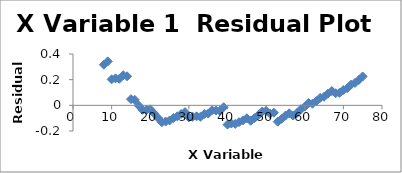
| Category | Series 0 |
|---|---|
| 8.0 | 0.316 |
| 9.0 | 0.343 |
| 10.0 | 0.203 |
| 11.0 | 0.21 |
| 12.0 | 0.207 |
| 13.0 | 0.234 |
| 14.0 | 0.226 |
| 15.0 | 0.048 |
| 16.0 | 0.043 |
| 17.0 | -0.001 |
| 18.0 | -0.035 |
| 19.0 | -0.036 |
| 20.0 | -0.031 |
| 21.0 | -0.064 |
| 22.0 | -0.098 |
| 23.0 | -0.132 |
| 24.0 | -0.126 |
| 25.0 | -0.118 |
| 26.0 | -0.099 |
| 27.0 | -0.086 |
| 28.0 | -0.068 |
| 29.0 | -0.053 |
| 30.0 | -0.094 |
| 31.0 | -0.089 |
| 32.0 | -0.086 |
| 33.0 | -0.089 |
| 34.0 | -0.068 |
| 35.0 | -0.064 |
| 36.0 | -0.038 |
| 37.0 | -0.041 |
| 38.0 | -0.043 |
| 39.0 | -0.014 |
| 40.0 | -0.15 |
| 41.0 | -0.142 |
| 42.0 | -0.145 |
| 43.0 | -0.131 |
| 44.0 | -0.117 |
| 45.0 | -0.101 |
| 46.0 | -0.12 |
| 47.0 | -0.099 |
| 48.0 | -0.076 |
| 49.0 | -0.048 |
| 50.0 | -0.043 |
| 51.0 | -0.065 |
| 52.0 | -0.057 |
| 53.0 | -0.127 |
| 54.0 | -0.105 |
| 55.0 | -0.081 |
| 56.0 | -0.062 |
| 57.0 | -0.08 |
| 58.0 | -0.059 |
| 59.0 | -0.03 |
| 60.0 | -0.01 |
| 61.0 | 0.018 |
| 62.0 | 0.013 |
| 63.0 | 0.032 |
| 64.0 | 0.058 |
| 65.0 | 0.067 |
| 66.0 | 0.091 |
| 67.0 | 0.112 |
| 68.0 | 0.094 |
| 69.0 | 0.098 |
| 70.0 | 0.119 |
| 71.0 | 0.133 |
| 72.0 | 0.161 |
| 73.0 | 0.174 |
| 74.0 | 0.197 |
| 75.0 | 0.225 |